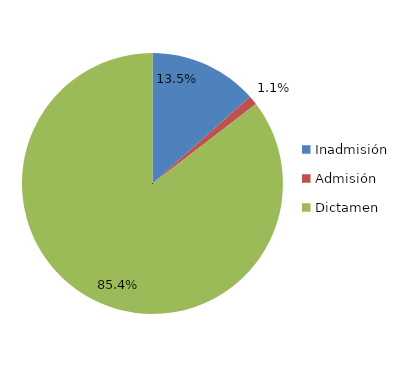
| Category | Series 0 |
|---|---|
| Inadmisión  | 227 |
| Admisión | 19 |
| Dictamen | 1443 |